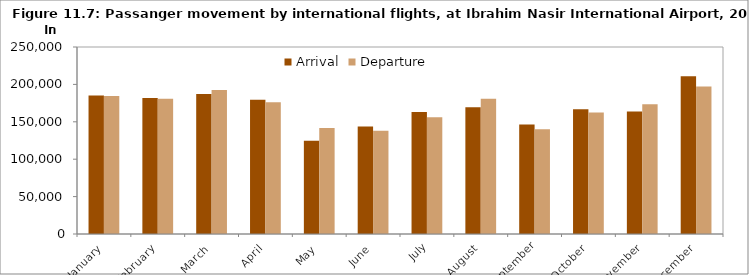
| Category | Arrival | Departure |
|---|---|---|
| January | 185073 | 184382 |
| February | 181716 | 180800 |
| March | 187082 | 192575 |
| April | 179428 | 176024 |
| May | 124830 | 141547 |
| June | 143580 | 137873 |
| July | 163224 | 155935 |
| August | 169600 | 180911 |
| September | 146522 | 139934 |
| October | 166734 | 162436 |
| November | 163740 | 173364 |
| December | 210869 | 197083 |